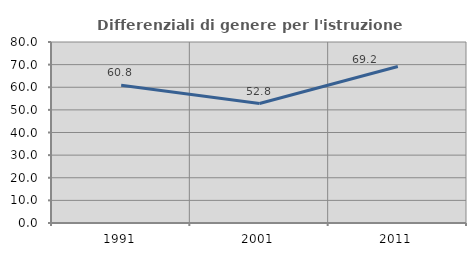
| Category | Differenziali di genere per l'istruzione superiore |
|---|---|
| 1991.0 | 60.843 |
| 2001.0 | 52.81 |
| 2011.0 | 69.185 |